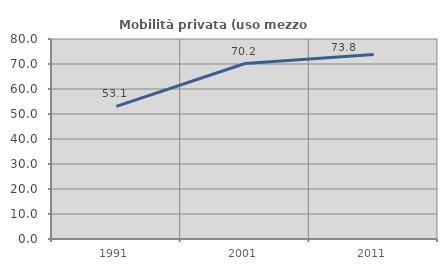
| Category | Mobilità privata (uso mezzo privato) |
|---|---|
| 1991.0 | 53.077 |
| 2001.0 | 70.196 |
| 2011.0 | 73.833 |